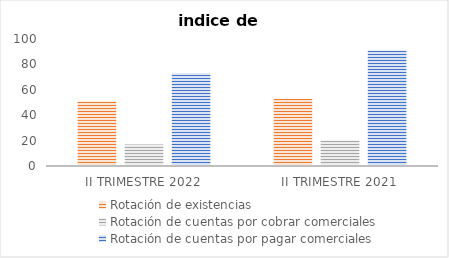
| Category | Rotación de existencias | Rotación de cuentas por cobrar comerciales | Rotación de cuentas por pagar comerciales |
|---|---|---|---|
| II TRIMESTRE 2022 | 51 | 17 | 73 |
| II TRIMESTRE 2021 | 53 | 20 | 91 |